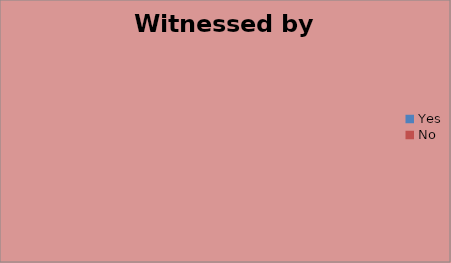
| Category | Witnessed by Bystander | Bystander CPR |
|---|---|---|
| Yes | 0 | 0 |
| No | 0 | 0 |